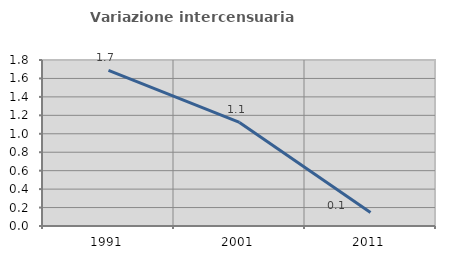
| Category | Variazione intercensuaria annua |
|---|---|
| 1991.0 | 1.687 |
| 2001.0 | 1.123 |
| 2011.0 | 0.146 |